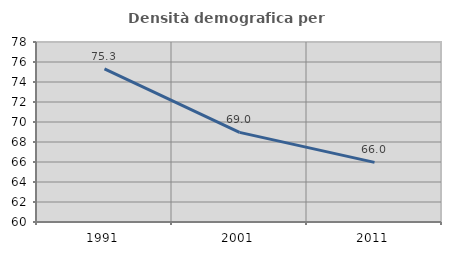
| Category | Densità demografica |
|---|---|
| 1991.0 | 75.308 |
| 2001.0 | 68.959 |
| 2011.0 | 65.965 |